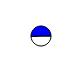
| Category | Series 0 |
|---|---|
| 0 | 14935 |
| 1 | 15472 |